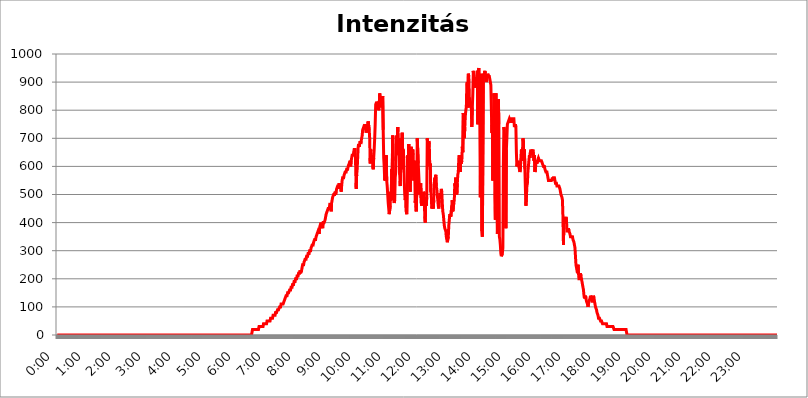
| Category | Intenzitás (W/m2) |
|---|---|
| 0.0 | 0 |
| 0.0006944444444444445 | 0 |
| 0.001388888888888889 | 0 |
| 0.0020833333333333333 | 0 |
| 0.002777777777777778 | 0 |
| 0.003472222222222222 | 0 |
| 0.004166666666666667 | 0 |
| 0.004861111111111111 | 0 |
| 0.005555555555555556 | 0 |
| 0.0062499999999999995 | 0 |
| 0.006944444444444444 | 0 |
| 0.007638888888888889 | 0 |
| 0.008333333333333333 | 0 |
| 0.009027777777777779 | 0 |
| 0.009722222222222222 | 0 |
| 0.010416666666666666 | 0 |
| 0.011111111111111112 | 0 |
| 0.011805555555555555 | 0 |
| 0.012499999999999999 | 0 |
| 0.013194444444444444 | 0 |
| 0.013888888888888888 | 0 |
| 0.014583333333333332 | 0 |
| 0.015277777777777777 | 0 |
| 0.015972222222222224 | 0 |
| 0.016666666666666666 | 0 |
| 0.017361111111111112 | 0 |
| 0.018055555555555557 | 0 |
| 0.01875 | 0 |
| 0.019444444444444445 | 0 |
| 0.02013888888888889 | 0 |
| 0.020833333333333332 | 0 |
| 0.02152777777777778 | 0 |
| 0.022222222222222223 | 0 |
| 0.02291666666666667 | 0 |
| 0.02361111111111111 | 0 |
| 0.024305555555555556 | 0 |
| 0.024999999999999998 | 0 |
| 0.025694444444444447 | 0 |
| 0.02638888888888889 | 0 |
| 0.027083333333333334 | 0 |
| 0.027777777777777776 | 0 |
| 0.02847222222222222 | 0 |
| 0.029166666666666664 | 0 |
| 0.029861111111111113 | 0 |
| 0.030555555555555555 | 0 |
| 0.03125 | 0 |
| 0.03194444444444445 | 0 |
| 0.03263888888888889 | 0 |
| 0.03333333333333333 | 0 |
| 0.034027777777777775 | 0 |
| 0.034722222222222224 | 0 |
| 0.035416666666666666 | 0 |
| 0.036111111111111115 | 0 |
| 0.03680555555555556 | 0 |
| 0.0375 | 0 |
| 0.03819444444444444 | 0 |
| 0.03888888888888889 | 0 |
| 0.03958333333333333 | 0 |
| 0.04027777777777778 | 0 |
| 0.04097222222222222 | 0 |
| 0.041666666666666664 | 0 |
| 0.042361111111111106 | 0 |
| 0.04305555555555556 | 0 |
| 0.043750000000000004 | 0 |
| 0.044444444444444446 | 0 |
| 0.04513888888888889 | 0 |
| 0.04583333333333334 | 0 |
| 0.04652777777777778 | 0 |
| 0.04722222222222222 | 0 |
| 0.04791666666666666 | 0 |
| 0.04861111111111111 | 0 |
| 0.049305555555555554 | 0 |
| 0.049999999999999996 | 0 |
| 0.05069444444444445 | 0 |
| 0.051388888888888894 | 0 |
| 0.052083333333333336 | 0 |
| 0.05277777777777778 | 0 |
| 0.05347222222222222 | 0 |
| 0.05416666666666667 | 0 |
| 0.05486111111111111 | 0 |
| 0.05555555555555555 | 0 |
| 0.05625 | 0 |
| 0.05694444444444444 | 0 |
| 0.057638888888888885 | 0 |
| 0.05833333333333333 | 0 |
| 0.05902777777777778 | 0 |
| 0.059722222222222225 | 0 |
| 0.06041666666666667 | 0 |
| 0.061111111111111116 | 0 |
| 0.06180555555555556 | 0 |
| 0.0625 | 0 |
| 0.06319444444444444 | 0 |
| 0.06388888888888888 | 0 |
| 0.06458333333333334 | 0 |
| 0.06527777777777778 | 0 |
| 0.06597222222222222 | 0 |
| 0.06666666666666667 | 0 |
| 0.06736111111111111 | 0 |
| 0.06805555555555555 | 0 |
| 0.06874999999999999 | 0 |
| 0.06944444444444443 | 0 |
| 0.07013888888888889 | 0 |
| 0.07083333333333333 | 0 |
| 0.07152777777777779 | 0 |
| 0.07222222222222223 | 0 |
| 0.07291666666666667 | 0 |
| 0.07361111111111111 | 0 |
| 0.07430555555555556 | 0 |
| 0.075 | 0 |
| 0.07569444444444444 | 0 |
| 0.0763888888888889 | 0 |
| 0.07708333333333334 | 0 |
| 0.07777777777777778 | 0 |
| 0.07847222222222222 | 0 |
| 0.07916666666666666 | 0 |
| 0.0798611111111111 | 0 |
| 0.08055555555555556 | 0 |
| 0.08125 | 0 |
| 0.08194444444444444 | 0 |
| 0.08263888888888889 | 0 |
| 0.08333333333333333 | 0 |
| 0.08402777777777777 | 0 |
| 0.08472222222222221 | 0 |
| 0.08541666666666665 | 0 |
| 0.08611111111111112 | 0 |
| 0.08680555555555557 | 0 |
| 0.08750000000000001 | 0 |
| 0.08819444444444445 | 0 |
| 0.08888888888888889 | 0 |
| 0.08958333333333333 | 0 |
| 0.09027777777777778 | 0 |
| 0.09097222222222222 | 0 |
| 0.09166666666666667 | 0 |
| 0.09236111111111112 | 0 |
| 0.09305555555555556 | 0 |
| 0.09375 | 0 |
| 0.09444444444444444 | 0 |
| 0.09513888888888888 | 0 |
| 0.09583333333333333 | 0 |
| 0.09652777777777777 | 0 |
| 0.09722222222222222 | 0 |
| 0.09791666666666667 | 0 |
| 0.09861111111111111 | 0 |
| 0.09930555555555555 | 0 |
| 0.09999999999999999 | 0 |
| 0.10069444444444443 | 0 |
| 0.1013888888888889 | 0 |
| 0.10208333333333335 | 0 |
| 0.10277777777777779 | 0 |
| 0.10347222222222223 | 0 |
| 0.10416666666666667 | 0 |
| 0.10486111111111111 | 0 |
| 0.10555555555555556 | 0 |
| 0.10625 | 0 |
| 0.10694444444444444 | 0 |
| 0.1076388888888889 | 0 |
| 0.10833333333333334 | 0 |
| 0.10902777777777778 | 0 |
| 0.10972222222222222 | 0 |
| 0.1111111111111111 | 0 |
| 0.11180555555555556 | 0 |
| 0.11180555555555556 | 0 |
| 0.1125 | 0 |
| 0.11319444444444444 | 0 |
| 0.11388888888888889 | 0 |
| 0.11458333333333333 | 0 |
| 0.11527777777777777 | 0 |
| 0.11597222222222221 | 0 |
| 0.11666666666666665 | 0 |
| 0.1173611111111111 | 0 |
| 0.11805555555555557 | 0 |
| 0.11944444444444445 | 0 |
| 0.12013888888888889 | 0 |
| 0.12083333333333333 | 0 |
| 0.12152777777777778 | 0 |
| 0.12222222222222223 | 0 |
| 0.12291666666666667 | 0 |
| 0.12291666666666667 | 0 |
| 0.12361111111111112 | 0 |
| 0.12430555555555556 | 0 |
| 0.125 | 0 |
| 0.12569444444444444 | 0 |
| 0.12638888888888888 | 0 |
| 0.12708333333333333 | 0 |
| 0.16875 | 0 |
| 0.12847222222222224 | 0 |
| 0.12916666666666668 | 0 |
| 0.12986111111111112 | 0 |
| 0.13055555555555556 | 0 |
| 0.13125 | 0 |
| 0.13194444444444445 | 0 |
| 0.1326388888888889 | 0 |
| 0.13333333333333333 | 0 |
| 0.13402777777777777 | 0 |
| 0.13402777777777777 | 0 |
| 0.13472222222222222 | 0 |
| 0.13541666666666666 | 0 |
| 0.1361111111111111 | 0 |
| 0.13749999999999998 | 0 |
| 0.13819444444444443 | 0 |
| 0.1388888888888889 | 0 |
| 0.13958333333333334 | 0 |
| 0.14027777777777778 | 0 |
| 0.14097222222222222 | 0 |
| 0.14166666666666666 | 0 |
| 0.1423611111111111 | 0 |
| 0.14305555555555557 | 0 |
| 0.14375000000000002 | 0 |
| 0.14444444444444446 | 0 |
| 0.1451388888888889 | 0 |
| 0.1451388888888889 | 0 |
| 0.14652777777777778 | 0 |
| 0.14722222222222223 | 0 |
| 0.14791666666666667 | 0 |
| 0.1486111111111111 | 0 |
| 0.14930555555555555 | 0 |
| 0.15 | 0 |
| 0.15069444444444444 | 0 |
| 0.15138888888888888 | 0 |
| 0.15208333333333332 | 0 |
| 0.15277777777777776 | 0 |
| 0.15347222222222223 | 0 |
| 0.15416666666666667 | 0 |
| 0.15486111111111112 | 0 |
| 0.15555555555555556 | 0 |
| 0.15625 | 0 |
| 0.15694444444444444 | 0 |
| 0.15763888888888888 | 0 |
| 0.15833333333333333 | 0 |
| 0.15902777777777777 | 0 |
| 0.15972222222222224 | 0 |
| 0.16041666666666668 | 0 |
| 0.16111111111111112 | 0 |
| 0.16180555555555556 | 0 |
| 0.1625 | 0 |
| 0.16319444444444445 | 0 |
| 0.1638888888888889 | 0 |
| 0.16458333333333333 | 0 |
| 0.16527777777777777 | 0 |
| 0.16597222222222222 | 0 |
| 0.16666666666666666 | 0 |
| 0.1673611111111111 | 0 |
| 0.16805555555555554 | 0 |
| 0.16874999999999998 | 0 |
| 0.16944444444444443 | 0 |
| 0.17013888888888887 | 0 |
| 0.1708333333333333 | 0 |
| 0.17152777777777775 | 0 |
| 0.17222222222222225 | 0 |
| 0.1729166666666667 | 0 |
| 0.17361111111111113 | 0 |
| 0.17430555555555557 | 0 |
| 0.17500000000000002 | 0 |
| 0.17569444444444446 | 0 |
| 0.1763888888888889 | 0 |
| 0.17708333333333334 | 0 |
| 0.17777777777777778 | 0 |
| 0.17847222222222223 | 0 |
| 0.17916666666666667 | 0 |
| 0.1798611111111111 | 0 |
| 0.18055555555555555 | 0 |
| 0.18125 | 0 |
| 0.18194444444444444 | 0 |
| 0.1826388888888889 | 0 |
| 0.18333333333333335 | 0 |
| 0.1840277777777778 | 0 |
| 0.18472222222222223 | 0 |
| 0.18541666666666667 | 0 |
| 0.18611111111111112 | 0 |
| 0.18680555555555556 | 0 |
| 0.1875 | 0 |
| 0.18819444444444444 | 0 |
| 0.18888888888888888 | 0 |
| 0.18958333333333333 | 0 |
| 0.19027777777777777 | 0 |
| 0.1909722222222222 | 0 |
| 0.19166666666666665 | 0 |
| 0.19236111111111112 | 0 |
| 0.19305555555555554 | 0 |
| 0.19375 | 0 |
| 0.19444444444444445 | 0 |
| 0.1951388888888889 | 0 |
| 0.19583333333333333 | 0 |
| 0.19652777777777777 | 0 |
| 0.19722222222222222 | 0 |
| 0.19791666666666666 | 0 |
| 0.1986111111111111 | 0 |
| 0.19930555555555554 | 0 |
| 0.19999999999999998 | 0 |
| 0.20069444444444443 | 0 |
| 0.20138888888888887 | 0 |
| 0.2020833333333333 | 0 |
| 0.2027777777777778 | 0 |
| 0.2034722222222222 | 0 |
| 0.2041666666666667 | 0 |
| 0.20486111111111113 | 0 |
| 0.20555555555555557 | 0 |
| 0.20625000000000002 | 0 |
| 0.20694444444444446 | 0 |
| 0.2076388888888889 | 0 |
| 0.20833333333333334 | 0 |
| 0.20902777777777778 | 0 |
| 0.20972222222222223 | 0 |
| 0.21041666666666667 | 0 |
| 0.2111111111111111 | 0 |
| 0.21180555555555555 | 0 |
| 0.2125 | 0 |
| 0.21319444444444444 | 0 |
| 0.2138888888888889 | 0 |
| 0.21458333333333335 | 0 |
| 0.2152777777777778 | 0 |
| 0.21597222222222223 | 0 |
| 0.21666666666666667 | 0 |
| 0.21736111111111112 | 0 |
| 0.21805555555555556 | 0 |
| 0.21875 | 0 |
| 0.21944444444444444 | 0 |
| 0.22013888888888888 | 0 |
| 0.22083333333333333 | 0 |
| 0.22152777777777777 | 0 |
| 0.2222222222222222 | 0 |
| 0.22291666666666665 | 0 |
| 0.2236111111111111 | 0 |
| 0.22430555555555556 | 0 |
| 0.225 | 0 |
| 0.22569444444444445 | 0 |
| 0.2263888888888889 | 0 |
| 0.22708333333333333 | 0 |
| 0.22777777777777777 | 0 |
| 0.22847222222222222 | 0 |
| 0.22916666666666666 | 0 |
| 0.2298611111111111 | 0 |
| 0.23055555555555554 | 0 |
| 0.23124999999999998 | 0 |
| 0.23194444444444443 | 0 |
| 0.23263888888888887 | 0 |
| 0.2333333333333333 | 0 |
| 0.2340277777777778 | 0 |
| 0.2347222222222222 | 0 |
| 0.2354166666666667 | 0 |
| 0.23611111111111113 | 0 |
| 0.23680555555555557 | 0 |
| 0.23750000000000002 | 0 |
| 0.23819444444444446 | 0 |
| 0.2388888888888889 | 0 |
| 0.23958333333333334 | 0 |
| 0.24027777777777778 | 0 |
| 0.24097222222222223 | 0 |
| 0.24166666666666667 | 0 |
| 0.2423611111111111 | 0 |
| 0.24305555555555555 | 0 |
| 0.24375 | 0 |
| 0.24444444444444446 | 0 |
| 0.24513888888888888 | 0 |
| 0.24583333333333335 | 0 |
| 0.2465277777777778 | 0 |
| 0.24722222222222223 | 0 |
| 0.24791666666666667 | 0 |
| 0.24861111111111112 | 0 |
| 0.24930555555555556 | 0 |
| 0.25 | 0 |
| 0.25069444444444444 | 0 |
| 0.2513888888888889 | 0 |
| 0.2520833333333333 | 0 |
| 0.25277777777777777 | 0 |
| 0.2534722222222222 | 0 |
| 0.25416666666666665 | 0 |
| 0.2548611111111111 | 0 |
| 0.2555555555555556 | 0 |
| 0.25625000000000003 | 0 |
| 0.2569444444444445 | 0 |
| 0.2576388888888889 | 0 |
| 0.25833333333333336 | 0 |
| 0.2590277777777778 | 0 |
| 0.25972222222222224 | 0 |
| 0.2604166666666667 | 0 |
| 0.2611111111111111 | 0 |
| 0.26180555555555557 | 0 |
| 0.2625 | 0 |
| 0.26319444444444445 | 0 |
| 0.2638888888888889 | 0 |
| 0.26458333333333334 | 0 |
| 0.2652777777777778 | 0 |
| 0.2659722222222222 | 0 |
| 0.26666666666666666 | 0 |
| 0.2673611111111111 | 0 |
| 0.26805555555555555 | 0 |
| 0.26875 | 0 |
| 0.26944444444444443 | 0 |
| 0.2701388888888889 | 0 |
| 0.2708333333333333 | 20 |
| 0.27152777777777776 | 20 |
| 0.2722222222222222 | 20 |
| 0.27291666666666664 | 20 |
| 0.2736111111111111 | 20 |
| 0.2743055555555555 | 20 |
| 0.27499999999999997 | 20 |
| 0.27569444444444446 | 20 |
| 0.27638888888888885 | 20 |
| 0.27708333333333335 | 20 |
| 0.2777777777777778 | 20 |
| 0.27847222222222223 | 20 |
| 0.2791666666666667 | 20 |
| 0.2798611111111111 | 30 |
| 0.28055555555555556 | 30 |
| 0.28125 | 30 |
| 0.28194444444444444 | 30 |
| 0.2826388888888889 | 30 |
| 0.2833333333333333 | 30 |
| 0.28402777777777777 | 30 |
| 0.2847222222222222 | 30 |
| 0.28541666666666665 | 30 |
| 0.28611111111111115 | 40 |
| 0.28680555555555554 | 40 |
| 0.28750000000000003 | 40 |
| 0.2881944444444445 | 40 |
| 0.2888888888888889 | 40 |
| 0.28958333333333336 | 40 |
| 0.2902777777777778 | 40 |
| 0.29097222222222224 | 50 |
| 0.2916666666666667 | 50 |
| 0.2923611111111111 | 50 |
| 0.29305555555555557 | 50 |
| 0.29375 | 50 |
| 0.29444444444444445 | 50 |
| 0.2951388888888889 | 50 |
| 0.29583333333333334 | 60 |
| 0.2965277777777778 | 60 |
| 0.2972222222222222 | 60 |
| 0.29791666666666666 | 60 |
| 0.2986111111111111 | 60 |
| 0.29930555555555555 | 70 |
| 0.3 | 70 |
| 0.30069444444444443 | 70 |
| 0.3013888888888889 | 70 |
| 0.3020833333333333 | 70 |
| 0.30277777777777776 | 80 |
| 0.3034722222222222 | 80 |
| 0.30416666666666664 | 80 |
| 0.3048611111111111 | 80 |
| 0.3055555555555555 | 90 |
| 0.30624999999999997 | 90 |
| 0.3069444444444444 | 90 |
| 0.3076388888888889 | 90 |
| 0.30833333333333335 | 100 |
| 0.3090277777777778 | 100 |
| 0.30972222222222223 | 100 |
| 0.3104166666666667 | 110 |
| 0.3111111111111111 | 110 |
| 0.31180555555555556 | 110 |
| 0.3125 | 110 |
| 0.31319444444444444 | 110 |
| 0.3138888888888889 | 110 |
| 0.3145833333333333 | 120 |
| 0.31527777777777777 | 120 |
| 0.3159722222222222 | 130 |
| 0.31666666666666665 | 130 |
| 0.31736111111111115 | 140 |
| 0.31805555555555554 | 140 |
| 0.31875000000000003 | 140 |
| 0.3194444444444445 | 150 |
| 0.3201388888888889 | 150 |
| 0.32083333333333336 | 150 |
| 0.3215277777777778 | 150 |
| 0.32222222222222224 | 160 |
| 0.3229166666666667 | 160 |
| 0.3236111111111111 | 160 |
| 0.32430555555555557 | 170 |
| 0.325 | 170 |
| 0.32569444444444445 | 170 |
| 0.3263888888888889 | 180 |
| 0.32708333333333334 | 180 |
| 0.3277777777777778 | 180 |
| 0.3284722222222222 | 190 |
| 0.32916666666666666 | 190 |
| 0.3298611111111111 | 190 |
| 0.33055555555555555 | 200 |
| 0.33125 | 200 |
| 0.33194444444444443 | 200 |
| 0.3326388888888889 | 210 |
| 0.3333333333333333 | 210 |
| 0.3340277777777778 | 210 |
| 0.3347222222222222 | 220 |
| 0.3354166666666667 | 220 |
| 0.3361111111111111 | 220 |
| 0.3368055555555556 | 230 |
| 0.33749999999999997 | 220 |
| 0.33819444444444446 | 220 |
| 0.33888888888888885 | 230 |
| 0.33958333333333335 | 240 |
| 0.34027777777777773 | 250 |
| 0.34097222222222223 | 250 |
| 0.3416666666666666 | 250 |
| 0.3423611111111111 | 260 |
| 0.3430555555555555 | 260 |
| 0.34375 | 270 |
| 0.3444444444444445 | 270 |
| 0.3451388888888889 | 270 |
| 0.3458333333333334 | 280 |
| 0.34652777777777777 | 280 |
| 0.34722222222222227 | 280 |
| 0.34791666666666665 | 290 |
| 0.34861111111111115 | 290 |
| 0.34930555555555554 | 290 |
| 0.35000000000000003 | 300 |
| 0.3506944444444444 | 300 |
| 0.3513888888888889 | 300 |
| 0.3520833333333333 | 310 |
| 0.3527777777777778 | 310 |
| 0.3534722222222222 | 320 |
| 0.3541666666666667 | 320 |
| 0.3548611111111111 | 320 |
| 0.35555555555555557 | 330 |
| 0.35625 | 330 |
| 0.35694444444444445 | 340 |
| 0.3576388888888889 | 340 |
| 0.35833333333333334 | 340 |
| 0.3590277777777778 | 350 |
| 0.3597222222222222 | 350 |
| 0.36041666666666666 | 360 |
| 0.3611111111111111 | 360 |
| 0.36180555555555555 | 370 |
| 0.3625 | 370 |
| 0.36319444444444443 | 360 |
| 0.3638888888888889 | 380 |
| 0.3645833333333333 | 390 |
| 0.3652777777777778 | 390 |
| 0.3659722222222222 | 400 |
| 0.3666666666666667 | 390 |
| 0.3673611111111111 | 390 |
| 0.3680555555555556 | 380 |
| 0.36874999999999997 | 400 |
| 0.36944444444444446 | 400 |
| 0.37013888888888885 | 400 |
| 0.37083333333333335 | 400 |
| 0.37152777777777773 | 410 |
| 0.37222222222222223 | 420 |
| 0.3729166666666666 | 430 |
| 0.3736111111111111 | 430 |
| 0.3743055555555555 | 440 |
| 0.375 | 440 |
| 0.3756944444444445 | 450 |
| 0.3763888888888889 | 450 |
| 0.3770833333333334 | 450 |
| 0.37777777777777777 | 460 |
| 0.37847222222222227 | 470 |
| 0.37916666666666665 | 460 |
| 0.37986111111111115 | 440 |
| 0.38055555555555554 | 470 |
| 0.38125000000000003 | 480 |
| 0.3819444444444444 | 490 |
| 0.3826388888888889 | 490 |
| 0.3833333333333333 | 500 |
| 0.3840277777777778 | 500 |
| 0.3847222222222222 | 500 |
| 0.3854166666666667 | 510 |
| 0.3861111111111111 | 500 |
| 0.38680555555555557 | 510 |
| 0.3875 | 520 |
| 0.38819444444444445 | 520 |
| 0.3888888888888889 | 530 |
| 0.38958333333333334 | 530 |
| 0.3902777777777778 | 530 |
| 0.3909722222222222 | 540 |
| 0.39166666666666666 | 520 |
| 0.3923611111111111 | 540 |
| 0.39305555555555555 | 530 |
| 0.39375 | 510 |
| 0.39444444444444443 | 530 |
| 0.3951388888888889 | 550 |
| 0.3958333333333333 | 560 |
| 0.3965277777777778 | 560 |
| 0.3972222222222222 | 560 |
| 0.3979166666666667 | 570 |
| 0.3986111111111111 | 570 |
| 0.3993055555555556 | 580 |
| 0.39999999999999997 | 580 |
| 0.40069444444444446 | 580 |
| 0.40138888888888885 | 590 |
| 0.40208333333333335 | 590 |
| 0.40277777777777773 | 590 |
| 0.40347222222222223 | 600 |
| 0.4041666666666666 | 600 |
| 0.4048611111111111 | 610 |
| 0.4055555555555555 | 610 |
| 0.40625 | 620 |
| 0.4069444444444445 | 600 |
| 0.4076388888888889 | 620 |
| 0.4083333333333334 | 630 |
| 0.40902777777777777 | 640 |
| 0.40972222222222227 | 640 |
| 0.41041666666666665 | 640 |
| 0.41111111111111115 | 640 |
| 0.41180555555555554 | 660 |
| 0.41250000000000003 | 660 |
| 0.4131944444444444 | 660 |
| 0.4138888888888889 | 600 |
| 0.4145833333333333 | 520 |
| 0.4152777777777778 | 570 |
| 0.4159722222222222 | 590 |
| 0.4166666666666667 | 630 |
| 0.4173611111111111 | 670 |
| 0.41805555555555557 | 680 |
| 0.41875 | 670 |
| 0.41944444444444445 | 680 |
| 0.4201388888888889 | 690 |
| 0.42083333333333334 | 680 |
| 0.4215277777777778 | 690 |
| 0.4222222222222222 | 690 |
| 0.42291666666666666 | 710 |
| 0.4236111111111111 | 730 |
| 0.42430555555555555 | 730 |
| 0.425 | 740 |
| 0.42569444444444443 | 740 |
| 0.4263888888888889 | 750 |
| 0.4270833333333333 | 740 |
| 0.4277777777777778 | 740 |
| 0.4284722222222222 | 720 |
| 0.4291666666666667 | 730 |
| 0.4298611111111111 | 750 |
| 0.4305555555555556 | 730 |
| 0.43124999999999997 | 760 |
| 0.43194444444444446 | 760 |
| 0.43263888888888885 | 730 |
| 0.43333333333333335 | 700 |
| 0.43402777777777773 | 610 |
| 0.43472222222222223 | 660 |
| 0.4354166666666666 | 630 |
| 0.4361111111111111 | 640 |
| 0.4368055555555555 | 620 |
| 0.4375 | 630 |
| 0.4381944444444445 | 590 |
| 0.4388888888888889 | 630 |
| 0.4395833333333334 | 660 |
| 0.44027777777777777 | 700 |
| 0.44097222222222227 | 750 |
| 0.44166666666666665 | 820 |
| 0.44236111111111115 | 820 |
| 0.44305555555555554 | 830 |
| 0.44375000000000003 | 820 |
| 0.4444444444444444 | 810 |
| 0.4451388888888889 | 830 |
| 0.4458333333333333 | 800 |
| 0.4465277777777778 | 820 |
| 0.4472222222222222 | 860 |
| 0.4479166666666667 | 840 |
| 0.4486111111111111 | 850 |
| 0.44930555555555557 | 820 |
| 0.45 | 810 |
| 0.45069444444444445 | 810 |
| 0.4513888888888889 | 850 |
| 0.45208333333333334 | 730 |
| 0.4527777777777778 | 630 |
| 0.4534722222222222 | 600 |
| 0.45416666666666666 | 550 |
| 0.4548611111111111 | 570 |
| 0.45555555555555555 | 550 |
| 0.45625 | 640 |
| 0.45694444444444443 | 550 |
| 0.4576388888888889 | 530 |
| 0.4583333333333333 | 500 |
| 0.4590277777777778 | 470 |
| 0.4597222222222222 | 470 |
| 0.4604166666666667 | 430 |
| 0.4611111111111111 | 430 |
| 0.4618055555555556 | 460 |
| 0.46249999999999997 | 510 |
| 0.46319444444444446 | 480 |
| 0.46388888888888885 | 590 |
| 0.46458333333333335 | 580 |
| 0.46527777777777773 | 710 |
| 0.46597222222222223 | 620 |
| 0.4666666666666666 | 480 |
| 0.4673611111111111 | 470 |
| 0.4680555555555555 | 480 |
| 0.46875 | 560 |
| 0.4694444444444445 | 580 |
| 0.4701388888888889 | 650 |
| 0.4708333333333334 | 710 |
| 0.47152777777777777 | 650 |
| 0.47222222222222227 | 740 |
| 0.47291666666666665 | 670 |
| 0.47361111111111115 | 640 |
| 0.47430555555555554 | 700 |
| 0.47500000000000003 | 570 |
| 0.4756944444444444 | 530 |
| 0.4763888888888889 | 590 |
| 0.4770833333333333 | 630 |
| 0.4777777777777778 | 590 |
| 0.4784722222222222 | 720 |
| 0.4791666666666667 | 650 |
| 0.4798611111111111 | 660 |
| 0.48055555555555557 | 630 |
| 0.48125 | 550 |
| 0.48194444444444445 | 500 |
| 0.4826388888888889 | 480 |
| 0.48333333333333334 | 500 |
| 0.4840277777777778 | 440 |
| 0.4847222222222222 | 430 |
| 0.48541666666666666 | 540 |
| 0.4861111111111111 | 640 |
| 0.48680555555555555 | 540 |
| 0.4875 | 680 |
| 0.48819444444444443 | 600 |
| 0.4888888888888889 | 520 |
| 0.4895833333333333 | 510 |
| 0.4902777777777778 | 610 |
| 0.4909722222222222 | 670 |
| 0.4916666666666667 | 630 |
| 0.4923611111111111 | 580 |
| 0.4930555555555556 | 660 |
| 0.49374999999999997 | 610 |
| 0.49444444444444446 | 550 |
| 0.49513888888888885 | 620 |
| 0.49583333333333335 | 580 |
| 0.49652777777777773 | 470 |
| 0.49722222222222223 | 500 |
| 0.4979166666666666 | 440 |
| 0.4986111111111111 | 510 |
| 0.4993055555555555 | 700 |
| 0.5 | 700 |
| 0.5006944444444444 | 610 |
| 0.5013888888888889 | 610 |
| 0.5020833333333333 | 530 |
| 0.5027777777777778 | 500 |
| 0.5034722222222222 | 530 |
| 0.5041666666666667 | 540 |
| 0.5048611111111111 | 470 |
| 0.5055555555555555 | 460 |
| 0.50625 | 490 |
| 0.5069444444444444 | 470 |
| 0.5076388888888889 | 480 |
| 0.5083333333333333 | 510 |
| 0.5090277777777777 | 500 |
| 0.5097222222222222 | 420 |
| 0.5104166666666666 | 400 |
| 0.5111111111111112 | 490 |
| 0.5118055555555555 | 460 |
| 0.5125000000000001 | 490 |
| 0.5131944444444444 | 700 |
| 0.513888888888889 | 670 |
| 0.5145833333333333 | 610 |
| 0.5152777777777778 | 690 |
| 0.5159722222222222 | 680 |
| 0.5166666666666667 | 600 |
| 0.517361111111111 | 610 |
| 0.5180555555555556 | 510 |
| 0.5187499999999999 | 500 |
| 0.5194444444444445 | 450 |
| 0.5201388888888888 | 450 |
| 0.5208333333333334 | 470 |
| 0.5215277777777778 | 450 |
| 0.5222222222222223 | 480 |
| 0.5229166666666667 | 540 |
| 0.5236111111111111 | 560 |
| 0.5243055555555556 | 550 |
| 0.525 | 570 |
| 0.5256944444444445 | 530 |
| 0.5263888888888889 | 520 |
| 0.5270833333333333 | 500 |
| 0.5277777777777778 | 480 |
| 0.5284722222222222 | 460 |
| 0.5291666666666667 | 450 |
| 0.5298611111111111 | 480 |
| 0.5305555555555556 | 500 |
| 0.53125 | 500 |
| 0.5319444444444444 | 500 |
| 0.5326388888888889 | 520 |
| 0.5333333333333333 | 510 |
| 0.5340277777777778 | 470 |
| 0.5347222222222222 | 440 |
| 0.5354166666666667 | 430 |
| 0.5361111111111111 | 410 |
| 0.5368055555555555 | 390 |
| 0.5375 | 380 |
| 0.5381944444444444 | 380 |
| 0.5388888888888889 | 370 |
| 0.5395833333333333 | 350 |
| 0.5402777777777777 | 340 |
| 0.5409722222222222 | 330 |
| 0.5416666666666666 | 330 |
| 0.5423611111111112 | 350 |
| 0.5430555555555555 | 390 |
| 0.5437500000000001 | 410 |
| 0.5444444444444444 | 430 |
| 0.545138888888889 | 430 |
| 0.5458333333333333 | 420 |
| 0.5465277777777778 | 420 |
| 0.5472222222222222 | 460 |
| 0.5479166666666667 | 480 |
| 0.548611111111111 | 440 |
| 0.5493055555555556 | 440 |
| 0.5499999999999999 | 470 |
| 0.5506944444444445 | 480 |
| 0.5513888888888888 | 540 |
| 0.5520833333333334 | 530 |
| 0.5527777777777778 | 560 |
| 0.5534722222222223 | 540 |
| 0.5541666666666667 | 500 |
| 0.5548611111111111 | 540 |
| 0.5555555555555556 | 570 |
| 0.55625 | 580 |
| 0.5569444444444445 | 630 |
| 0.5576388888888889 | 640 |
| 0.5583333333333333 | 640 |
| 0.5590277777777778 | 580 |
| 0.5597222222222222 | 630 |
| 0.5604166666666667 | 610 |
| 0.5611111111111111 | 620 |
| 0.5618055555555556 | 670 |
| 0.5625 | 650 |
| 0.5631944444444444 | 790 |
| 0.5638888888888889 | 760 |
| 0.5645833333333333 | 700 |
| 0.5652777777777778 | 740 |
| 0.5659722222222222 | 780 |
| 0.5666666666666667 | 800 |
| 0.5673611111111111 | 810 |
| 0.5680555555555555 | 890 |
| 0.56875 | 900 |
| 0.5694444444444444 | 810 |
| 0.5701388888888889 | 930 |
| 0.5708333333333333 | 920 |
| 0.5715277777777777 | 850 |
| 0.5722222222222222 | 810 |
| 0.5729166666666666 | 810 |
| 0.5736111111111112 | 830 |
| 0.5743055555555555 | 810 |
| 0.5750000000000001 | 740 |
| 0.5756944444444444 | 810 |
| 0.576388888888889 | 860 |
| 0.5770833333333333 | 940 |
| 0.5777777777777778 | 890 |
| 0.5784722222222222 | 900 |
| 0.5791666666666667 | 890 |
| 0.579861111111111 | 880 |
| 0.5805555555555556 | 900 |
| 0.5812499999999999 | 910 |
| 0.5819444444444445 | 910 |
| 0.5826388888888888 | 940 |
| 0.5833333333333334 | 750 |
| 0.5840277777777778 | 940 |
| 0.5847222222222223 | 950 |
| 0.5854166666666667 | 950 |
| 0.5861111111111111 | 750 |
| 0.5868055555555556 | 490 |
| 0.5875 | 780 |
| 0.5881944444444445 | 930 |
| 0.5888888888888889 | 370 |
| 0.5895833333333333 | 350 |
| 0.5902777777777778 | 350 |
| 0.5909722222222222 | 930 |
| 0.5916666666666667 | 930 |
| 0.5923611111111111 | 920 |
| 0.5930555555555556 | 940 |
| 0.59375 | 930 |
| 0.5944444444444444 | 910 |
| 0.5951388888888889 | 900 |
| 0.5958333333333333 | 910 |
| 0.5965277777777778 | 920 |
| 0.5972222222222222 | 930 |
| 0.5979166666666667 | 920 |
| 0.5986111111111111 | 920 |
| 0.5993055555555555 | 920 |
| 0.6 | 910 |
| 0.6006944444444444 | 910 |
| 0.6013888888888889 | 890 |
| 0.6020833333333333 | 890 |
| 0.6027777777777777 | 720 |
| 0.6034722222222222 | 770 |
| 0.6041666666666666 | 550 |
| 0.6048611111111112 | 670 |
| 0.6055555555555555 | 860 |
| 0.6062500000000001 | 840 |
| 0.6069444444444444 | 490 |
| 0.607638888888889 | 410 |
| 0.6083333333333333 | 860 |
| 0.6090277777777778 | 650 |
| 0.6097222222222222 | 490 |
| 0.6104166666666667 | 360 |
| 0.611111111111111 | 410 |
| 0.6118055555555556 | 840 |
| 0.6124999999999999 | 750 |
| 0.6131944444444445 | 350 |
| 0.6138888888888888 | 340 |
| 0.6145833333333334 | 320 |
| 0.6152777777777778 | 290 |
| 0.6159722222222223 | 280 |
| 0.6166666666666667 | 280 |
| 0.6173611111111111 | 290 |
| 0.6180555555555556 | 310 |
| 0.61875 | 610 |
| 0.6194444444444445 | 740 |
| 0.6201388888888889 | 730 |
| 0.6208333333333333 | 730 |
| 0.6215277777777778 | 610 |
| 0.6222222222222222 | 380 |
| 0.6229166666666667 | 660 |
| 0.6236111111111111 | 700 |
| 0.6243055555555556 | 750 |
| 0.625 | 750 |
| 0.6256944444444444 | 760 |
| 0.6263888888888889 | 760 |
| 0.6270833333333333 | 770 |
| 0.6277777777777778 | 770 |
| 0.6284722222222222 | 760 |
| 0.6291666666666667 | 760 |
| 0.6298611111111111 | 760 |
| 0.6305555555555555 | 770 |
| 0.63125 | 770 |
| 0.6319444444444444 | 770 |
| 0.6326388888888889 | 770 |
| 0.6333333333333333 | 770 |
| 0.6340277777777777 | 740 |
| 0.6347222222222222 | 740 |
| 0.6354166666666666 | 750 |
| 0.6361111111111112 | 740 |
| 0.6368055555555555 | 650 |
| 0.6375000000000001 | 600 |
| 0.6381944444444444 | 600 |
| 0.638888888888889 | 620 |
| 0.6395833333333333 | 610 |
| 0.6402777777777778 | 600 |
| 0.6409722222222222 | 600 |
| 0.6416666666666667 | 580 |
| 0.642361111111111 | 590 |
| 0.6430555555555556 | 630 |
| 0.6437499999999999 | 660 |
| 0.6444444444444445 | 620 |
| 0.6451388888888888 | 640 |
| 0.6458333333333334 | 700 |
| 0.6465277777777778 | 690 |
| 0.6472222222222223 | 630 |
| 0.6479166666666667 | 660 |
| 0.6486111111111111 | 590 |
| 0.6493055555555556 | 520 |
| 0.65 | 460 |
| 0.6506944444444445 | 490 |
| 0.6513888888888889 | 530 |
| 0.6520833333333333 | 540 |
| 0.6527777777777778 | 580 |
| 0.6534722222222222 | 600 |
| 0.6541666666666667 | 620 |
| 0.6548611111111111 | 640 |
| 0.6555555555555556 | 630 |
| 0.65625 | 650 |
| 0.6569444444444444 | 660 |
| 0.6576388888888889 | 660 |
| 0.6583333333333333 | 650 |
| 0.6590277777777778 | 650 |
| 0.6597222222222222 | 660 |
| 0.6604166666666667 | 640 |
| 0.6611111111111111 | 620 |
| 0.6618055555555555 | 640 |
| 0.6625 | 580 |
| 0.6631944444444444 | 590 |
| 0.6638888888888889 | 610 |
| 0.6645833333333333 | 620 |
| 0.6652777777777777 | 610 |
| 0.6659722222222222 | 620 |
| 0.6666666666666666 | 620 |
| 0.6673611111111111 | 630 |
| 0.6680555555555556 | 630 |
| 0.6687500000000001 | 620 |
| 0.6694444444444444 | 620 |
| 0.6701388888888888 | 620 |
| 0.6708333333333334 | 620 |
| 0.6715277777777778 | 620 |
| 0.6722222222222222 | 620 |
| 0.6729166666666666 | 610 |
| 0.6736111111111112 | 610 |
| 0.6743055555555556 | 600 |
| 0.6749999999999999 | 600 |
| 0.6756944444444444 | 600 |
| 0.6763888888888889 | 590 |
| 0.6770833333333334 | 590 |
| 0.6777777777777777 | 580 |
| 0.6784722222222223 | 580 |
| 0.6791666666666667 | 580 |
| 0.6798611111111111 | 580 |
| 0.6805555555555555 | 560 |
| 0.68125 | 550 |
| 0.6819444444444445 | 550 |
| 0.6826388888888889 | 550 |
| 0.6833333333333332 | 550 |
| 0.6840277777777778 | 550 |
| 0.6847222222222222 | 550 |
| 0.6854166666666667 | 550 |
| 0.686111111111111 | 550 |
| 0.6868055555555556 | 560 |
| 0.6875 | 550 |
| 0.6881944444444444 | 560 |
| 0.688888888888889 | 560 |
| 0.6895833333333333 | 560 |
| 0.6902777777777778 | 550 |
| 0.6909722222222222 | 540 |
| 0.6916666666666668 | 540 |
| 0.6923611111111111 | 540 |
| 0.6930555555555555 | 530 |
| 0.69375 | 530 |
| 0.6944444444444445 | 530 |
| 0.6951388888888889 | 530 |
| 0.6958333333333333 | 530 |
| 0.6965277777777777 | 530 |
| 0.6972222222222223 | 520 |
| 0.6979166666666666 | 510 |
| 0.6986111111111111 | 500 |
| 0.6993055555555556 | 500 |
| 0.7000000000000001 | 490 |
| 0.7006944444444444 | 480 |
| 0.7013888888888888 | 420 |
| 0.7020833333333334 | 320 |
| 0.7027777777777778 | 420 |
| 0.7034722222222222 | 410 |
| 0.7041666666666666 | 420 |
| 0.7048611111111112 | 410 |
| 0.7055555555555556 | 420 |
| 0.7062499999999999 | 410 |
| 0.7069444444444444 | 370 |
| 0.7076388888888889 | 370 |
| 0.7083333333333334 | 370 |
| 0.7090277777777777 | 380 |
| 0.7097222222222223 | 370 |
| 0.7104166666666667 | 370 |
| 0.7111111111111111 | 360 |
| 0.7118055555555555 | 350 |
| 0.7125 | 350 |
| 0.7131944444444445 | 350 |
| 0.7138888888888889 | 350 |
| 0.7145833333333332 | 350 |
| 0.7152777777777778 | 340 |
| 0.7159722222222222 | 340 |
| 0.7166666666666667 | 330 |
| 0.717361111111111 | 320 |
| 0.7180555555555556 | 310 |
| 0.71875 | 280 |
| 0.7194444444444444 | 250 |
| 0.720138888888889 | 240 |
| 0.7208333333333333 | 240 |
| 0.7215277777777778 | 220 |
| 0.7222222222222222 | 250 |
| 0.7229166666666668 | 220 |
| 0.7236111111111111 | 200 |
| 0.7243055555555555 | 200 |
| 0.725 | 200 |
| 0.7256944444444445 | 220 |
| 0.7263888888888889 | 210 |
| 0.7270833333333333 | 210 |
| 0.7277777777777777 | 190 |
| 0.7284722222222223 | 180 |
| 0.7291666666666666 | 170 |
| 0.7298611111111111 | 160 |
| 0.7305555555555556 | 140 |
| 0.7312500000000001 | 130 |
| 0.7319444444444444 | 130 |
| 0.7326388888888888 | 140 |
| 0.7333333333333334 | 130 |
| 0.7340277777777778 | 120 |
| 0.7347222222222222 | 120 |
| 0.7354166666666666 | 110 |
| 0.7361111111111112 | 100 |
| 0.7368055555555556 | 110 |
| 0.7374999999999999 | 120 |
| 0.7381944444444444 | 120 |
| 0.7388888888888889 | 130 |
| 0.7395833333333334 | 140 |
| 0.7402777777777777 | 140 |
| 0.7409722222222223 | 130 |
| 0.7416666666666667 | 120 |
| 0.7423611111111111 | 120 |
| 0.7430555555555555 | 120 |
| 0.74375 | 140 |
| 0.7444444444444445 | 130 |
| 0.7451388888888889 | 120 |
| 0.7458333333333332 | 110 |
| 0.7465277777777778 | 100 |
| 0.7472222222222222 | 100 |
| 0.7479166666666667 | 90 |
| 0.748611111111111 | 80 |
| 0.7493055555555556 | 80 |
| 0.75 | 70 |
| 0.7506944444444444 | 60 |
| 0.751388888888889 | 60 |
| 0.7520833333333333 | 60 |
| 0.7527777777777778 | 60 |
| 0.7534722222222222 | 50 |
| 0.7541666666666668 | 50 |
| 0.7548611111111111 | 50 |
| 0.7555555555555555 | 50 |
| 0.75625 | 40 |
| 0.7569444444444445 | 40 |
| 0.7576388888888889 | 40 |
| 0.7583333333333333 | 40 |
| 0.7590277777777777 | 40 |
| 0.7597222222222223 | 40 |
| 0.7604166666666666 | 40 |
| 0.7611111111111111 | 40 |
| 0.7618055555555556 | 40 |
| 0.7625000000000001 | 30 |
| 0.7631944444444444 | 30 |
| 0.7638888888888888 | 30 |
| 0.7645833333333334 | 30 |
| 0.7652777777777778 | 30 |
| 0.7659722222222222 | 30 |
| 0.7666666666666666 | 30 |
| 0.7673611111111112 | 30 |
| 0.7680555555555556 | 30 |
| 0.7687499999999999 | 30 |
| 0.7694444444444444 | 30 |
| 0.7701388888888889 | 30 |
| 0.7708333333333334 | 30 |
| 0.7715277777777777 | 30 |
| 0.7722222222222223 | 20 |
| 0.7729166666666667 | 20 |
| 0.7736111111111111 | 20 |
| 0.7743055555555555 | 20 |
| 0.775 | 20 |
| 0.7756944444444445 | 20 |
| 0.7763888888888889 | 20 |
| 0.7770833333333332 | 20 |
| 0.7777777777777778 | 20 |
| 0.7784722222222222 | 20 |
| 0.7791666666666667 | 20 |
| 0.779861111111111 | 20 |
| 0.7805555555555556 | 20 |
| 0.78125 | 20 |
| 0.7819444444444444 | 20 |
| 0.782638888888889 | 20 |
| 0.7833333333333333 | 20 |
| 0.7840277777777778 | 20 |
| 0.7847222222222222 | 20 |
| 0.7854166666666668 | 20 |
| 0.7861111111111111 | 20 |
| 0.7868055555555555 | 20 |
| 0.7875 | 20 |
| 0.7881944444444445 | 20 |
| 0.7888888888888889 | 20 |
| 0.7895833333333333 | 20 |
| 0.7902777777777777 | 0 |
| 0.7909722222222223 | 0 |
| 0.7916666666666666 | 0 |
| 0.7923611111111111 | 0 |
| 0.7930555555555556 | 0 |
| 0.7937500000000001 | 0 |
| 0.7944444444444444 | 0 |
| 0.7951388888888888 | 0 |
| 0.7958333333333334 | 0 |
| 0.7965277777777778 | 0 |
| 0.7972222222222222 | 0 |
| 0.7979166666666666 | 0 |
| 0.7986111111111112 | 0 |
| 0.7993055555555556 | 0 |
| 0.7999999999999999 | 0 |
| 0.8006944444444444 | 0 |
| 0.8013888888888889 | 0 |
| 0.8020833333333334 | 0 |
| 0.8027777777777777 | 0 |
| 0.8034722222222223 | 0 |
| 0.8041666666666667 | 0 |
| 0.8048611111111111 | 0 |
| 0.8055555555555555 | 0 |
| 0.80625 | 0 |
| 0.8069444444444445 | 0 |
| 0.8076388888888889 | 0 |
| 0.8083333333333332 | 0 |
| 0.8090277777777778 | 0 |
| 0.8097222222222222 | 0 |
| 0.8104166666666667 | 0 |
| 0.811111111111111 | 0 |
| 0.8118055555555556 | 0 |
| 0.8125 | 0 |
| 0.8131944444444444 | 0 |
| 0.813888888888889 | 0 |
| 0.8145833333333333 | 0 |
| 0.8152777777777778 | 0 |
| 0.8159722222222222 | 0 |
| 0.8166666666666668 | 0 |
| 0.8173611111111111 | 0 |
| 0.8180555555555555 | 0 |
| 0.81875 | 0 |
| 0.8194444444444445 | 0 |
| 0.8201388888888889 | 0 |
| 0.8208333333333333 | 0 |
| 0.8215277777777777 | 0 |
| 0.8222222222222223 | 0 |
| 0.8229166666666666 | 0 |
| 0.8236111111111111 | 0 |
| 0.8243055555555556 | 0 |
| 0.8250000000000001 | 0 |
| 0.8256944444444444 | 0 |
| 0.8263888888888888 | 0 |
| 0.8270833333333334 | 0 |
| 0.8277777777777778 | 0 |
| 0.8284722222222222 | 0 |
| 0.8291666666666666 | 0 |
| 0.8298611111111112 | 0 |
| 0.8305555555555556 | 0 |
| 0.8312499999999999 | 0 |
| 0.8319444444444444 | 0 |
| 0.8326388888888889 | 0 |
| 0.8333333333333334 | 0 |
| 0.8340277777777777 | 0 |
| 0.8347222222222223 | 0 |
| 0.8354166666666667 | 0 |
| 0.8361111111111111 | 0 |
| 0.8368055555555555 | 0 |
| 0.8375 | 0 |
| 0.8381944444444445 | 0 |
| 0.8388888888888889 | 0 |
| 0.8395833333333332 | 0 |
| 0.8402777777777778 | 0 |
| 0.8409722222222222 | 0 |
| 0.8416666666666667 | 0 |
| 0.842361111111111 | 0 |
| 0.8430555555555556 | 0 |
| 0.84375 | 0 |
| 0.8444444444444444 | 0 |
| 0.845138888888889 | 0 |
| 0.8458333333333333 | 0 |
| 0.8465277777777778 | 0 |
| 0.8472222222222222 | 0 |
| 0.8479166666666668 | 0 |
| 0.8486111111111111 | 0 |
| 0.8493055555555555 | 0 |
| 0.85 | 0 |
| 0.8506944444444445 | 0 |
| 0.8513888888888889 | 0 |
| 0.8520833333333333 | 0 |
| 0.8527777777777777 | 0 |
| 0.8534722222222223 | 0 |
| 0.8541666666666666 | 0 |
| 0.8548611111111111 | 0 |
| 0.8555555555555556 | 0 |
| 0.8562500000000001 | 0 |
| 0.8569444444444444 | 0 |
| 0.8576388888888888 | 0 |
| 0.8583333333333334 | 0 |
| 0.8590277777777778 | 0 |
| 0.8597222222222222 | 0 |
| 0.8604166666666666 | 0 |
| 0.8611111111111112 | 0 |
| 0.8618055555555556 | 0 |
| 0.8624999999999999 | 0 |
| 0.8631944444444444 | 0 |
| 0.8638888888888889 | 0 |
| 0.8645833333333334 | 0 |
| 0.8652777777777777 | 0 |
| 0.8659722222222223 | 0 |
| 0.8666666666666667 | 0 |
| 0.8673611111111111 | 0 |
| 0.8680555555555555 | 0 |
| 0.86875 | 0 |
| 0.8694444444444445 | 0 |
| 0.8701388888888889 | 0 |
| 0.8708333333333332 | 0 |
| 0.8715277777777778 | 0 |
| 0.8722222222222222 | 0 |
| 0.8729166666666667 | 0 |
| 0.873611111111111 | 0 |
| 0.8743055555555556 | 0 |
| 0.875 | 0 |
| 0.8756944444444444 | 0 |
| 0.876388888888889 | 0 |
| 0.8770833333333333 | 0 |
| 0.8777777777777778 | 0 |
| 0.8784722222222222 | 0 |
| 0.8791666666666668 | 0 |
| 0.8798611111111111 | 0 |
| 0.8805555555555555 | 0 |
| 0.88125 | 0 |
| 0.8819444444444445 | 0 |
| 0.8826388888888889 | 0 |
| 0.8833333333333333 | 0 |
| 0.8840277777777777 | 0 |
| 0.8847222222222223 | 0 |
| 0.8854166666666666 | 0 |
| 0.8861111111111111 | 0 |
| 0.8868055555555556 | 0 |
| 0.8875000000000001 | 0 |
| 0.8881944444444444 | 0 |
| 0.8888888888888888 | 0 |
| 0.8895833333333334 | 0 |
| 0.8902777777777778 | 0 |
| 0.8909722222222222 | 0 |
| 0.8916666666666666 | 0 |
| 0.8923611111111112 | 0 |
| 0.8930555555555556 | 0 |
| 0.8937499999999999 | 0 |
| 0.8944444444444444 | 0 |
| 0.8951388888888889 | 0 |
| 0.8958333333333334 | 0 |
| 0.8965277777777777 | 0 |
| 0.8972222222222223 | 0 |
| 0.8979166666666667 | 0 |
| 0.8986111111111111 | 0 |
| 0.8993055555555555 | 0 |
| 0.9 | 0 |
| 0.9006944444444445 | 0 |
| 0.9013888888888889 | 0 |
| 0.9020833333333332 | 0 |
| 0.9027777777777778 | 0 |
| 0.9034722222222222 | 0 |
| 0.9041666666666667 | 0 |
| 0.904861111111111 | 0 |
| 0.9055555555555556 | 0 |
| 0.90625 | 0 |
| 0.9069444444444444 | 0 |
| 0.907638888888889 | 0 |
| 0.9083333333333333 | 0 |
| 0.9090277777777778 | 0 |
| 0.9097222222222222 | 0 |
| 0.9104166666666668 | 0 |
| 0.9111111111111111 | 0 |
| 0.9118055555555555 | 0 |
| 0.9125 | 0 |
| 0.9131944444444445 | 0 |
| 0.9138888888888889 | 0 |
| 0.9145833333333333 | 0 |
| 0.9152777777777777 | 0 |
| 0.9159722222222223 | 0 |
| 0.9166666666666666 | 0 |
| 0.9173611111111111 | 0 |
| 0.9180555555555556 | 0 |
| 0.9187500000000001 | 0 |
| 0.9194444444444444 | 0 |
| 0.9201388888888888 | 0 |
| 0.9208333333333334 | 0 |
| 0.9215277777777778 | 0 |
| 0.9222222222222222 | 0 |
| 0.9229166666666666 | 0 |
| 0.9236111111111112 | 0 |
| 0.9243055555555556 | 0 |
| 0.9249999999999999 | 0 |
| 0.9256944444444444 | 0 |
| 0.9263888888888889 | 0 |
| 0.9270833333333334 | 0 |
| 0.9277777777777777 | 0 |
| 0.9284722222222223 | 0 |
| 0.9291666666666667 | 0 |
| 0.9298611111111111 | 0 |
| 0.9305555555555555 | 0 |
| 0.93125 | 0 |
| 0.9319444444444445 | 0 |
| 0.9326388888888889 | 0 |
| 0.9333333333333332 | 0 |
| 0.9340277777777778 | 0 |
| 0.9347222222222222 | 0 |
| 0.9354166666666667 | 0 |
| 0.936111111111111 | 0 |
| 0.9368055555555556 | 0 |
| 0.9375 | 0 |
| 0.9381944444444444 | 0 |
| 0.938888888888889 | 0 |
| 0.9395833333333333 | 0 |
| 0.9402777777777778 | 0 |
| 0.9409722222222222 | 0 |
| 0.9416666666666668 | 0 |
| 0.9423611111111111 | 0 |
| 0.9430555555555555 | 0 |
| 0.94375 | 0 |
| 0.9444444444444445 | 0 |
| 0.9451388888888889 | 0 |
| 0.9458333333333333 | 0 |
| 0.9465277777777777 | 0 |
| 0.9472222222222223 | 0 |
| 0.9479166666666666 | 0 |
| 0.9486111111111111 | 0 |
| 0.9493055555555556 | 0 |
| 0.9500000000000001 | 0 |
| 0.9506944444444444 | 0 |
| 0.9513888888888888 | 0 |
| 0.9520833333333334 | 0 |
| 0.9527777777777778 | 0 |
| 0.9534722222222222 | 0 |
| 0.9541666666666666 | 0 |
| 0.9548611111111112 | 0 |
| 0.9555555555555556 | 0 |
| 0.9562499999999999 | 0 |
| 0.9569444444444444 | 0 |
| 0.9576388888888889 | 0 |
| 0.9583333333333334 | 0 |
| 0.9590277777777777 | 0 |
| 0.9597222222222223 | 0 |
| 0.9604166666666667 | 0 |
| 0.9611111111111111 | 0 |
| 0.9618055555555555 | 0 |
| 0.9625 | 0 |
| 0.9631944444444445 | 0 |
| 0.9638888888888889 | 0 |
| 0.9645833333333332 | 0 |
| 0.9652777777777778 | 0 |
| 0.9659722222222222 | 0 |
| 0.9666666666666667 | 0 |
| 0.967361111111111 | 0 |
| 0.9680555555555556 | 0 |
| 0.96875 | 0 |
| 0.9694444444444444 | 0 |
| 0.970138888888889 | 0 |
| 0.9708333333333333 | 0 |
| 0.9715277777777778 | 0 |
| 0.9722222222222222 | 0 |
| 0.9729166666666668 | 0 |
| 0.9736111111111111 | 0 |
| 0.9743055555555555 | 0 |
| 0.975 | 0 |
| 0.9756944444444445 | 0 |
| 0.9763888888888889 | 0 |
| 0.9770833333333333 | 0 |
| 0.9777777777777777 | 0 |
| 0.9784722222222223 | 0 |
| 0.9791666666666666 | 0 |
| 0.9798611111111111 | 0 |
| 0.9805555555555556 | 0 |
| 0.9812500000000001 | 0 |
| 0.9819444444444444 | 0 |
| 0.9826388888888888 | 0 |
| 0.9833333333333334 | 0 |
| 0.9840277777777778 | 0 |
| 0.9847222222222222 | 0 |
| 0.9854166666666666 | 0 |
| 0.9861111111111112 | 0 |
| 0.9868055555555556 | 0 |
| 0.9874999999999999 | 0 |
| 0.9881944444444444 | 0 |
| 0.9888888888888889 | 0 |
| 0.9895833333333334 | 0 |
| 0.9902777777777777 | 0 |
| 0.9909722222222223 | 0 |
| 0.9916666666666667 | 0 |
| 0.9923611111111111 | 0 |
| 0.9930555555555555 | 0 |
| 0.99375 | 0 |
| 0.9944444444444445 | 0 |
| 0.9951388888888889 | 0 |
| 0.9958333333333332 | 0 |
| 0.9965277777777778 | 0 |
| 0.9972222222222222 | 0 |
| 0.9979166666666667 | 0 |
| 0.998611111111111 | 0 |
| 0.9993055555555556 | 0 |